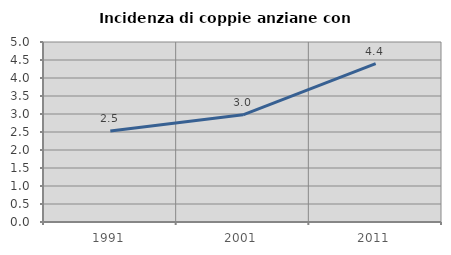
| Category | Incidenza di coppie anziane con figli |
|---|---|
| 1991.0 | 2.528 |
| 2001.0 | 2.978 |
| 2011.0 | 4.401 |